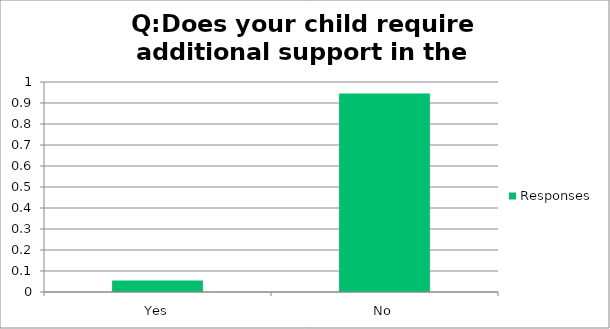
| Category | Responses |
|---|---|
| Yes | 0.055 |
| No | 0.945 |